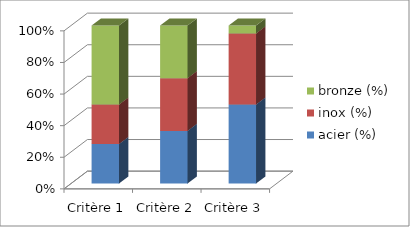
| Category | acier (%) | inox (%) | bronze (%) |
|---|---|---|---|
| Critère 1 | 25 | 25 | 50 |
| Critère 2 | 33 | 33 | 33 |
| Critère 3 | 50 | 45 | 5 |